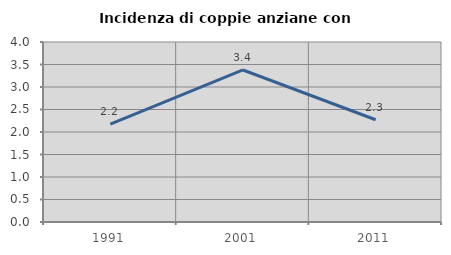
| Category | Incidenza di coppie anziane con figli |
|---|---|
| 1991.0 | 2.174 |
| 2001.0 | 3.378 |
| 2011.0 | 2.273 |